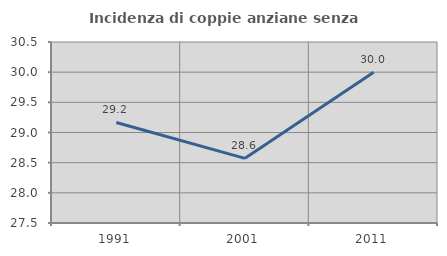
| Category | Incidenza di coppie anziane senza figli  |
|---|---|
| 1991.0 | 29.167 |
| 2001.0 | 28.571 |
| 2011.0 | 30 |